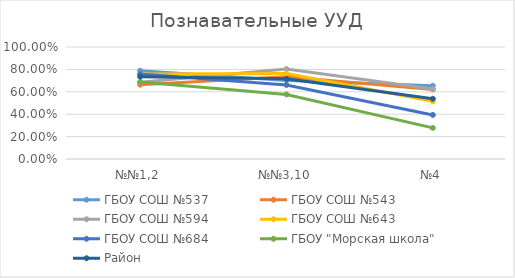
| Category | ГБОУ СОШ №537 | ГБОУ СОШ №543 | ГБОУ СОШ №594 | ГБОУ СОШ №643 | ГБОУ СОШ №684 | ГБОУ "Морская школа" | Район |
|---|---|---|---|---|---|---|---|
| №№1,2 | 0.788 | 0.663 | 0.684 | 0.758 | 0.758 | 0.687 | 0.735 |
| №№3,10 | 0.702 | 0.734 | 0.803 | 0.764 | 0.661 | 0.576 | 0.716 |
| №4 | 0.654 | 0.621 | 0.626 | 0.515 | 0.394 | 0.278 | 0.538 |